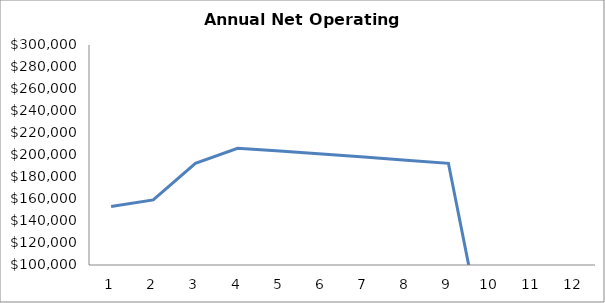
| Category | Series 0 |
|---|---|
| 0 | 153103.657 |
| 1 | 159161.623 |
| 2 | 192480.918 |
| 3 | 206104.036 |
| 4 | 203528.312 |
| 5 | 200875.315 |
| 6 | 198142.729 |
| 7 | 195328.164 |
| 8 | 192429.163 |
| 9 | 0 |
| 10 | 0 |
| 11 | 0 |